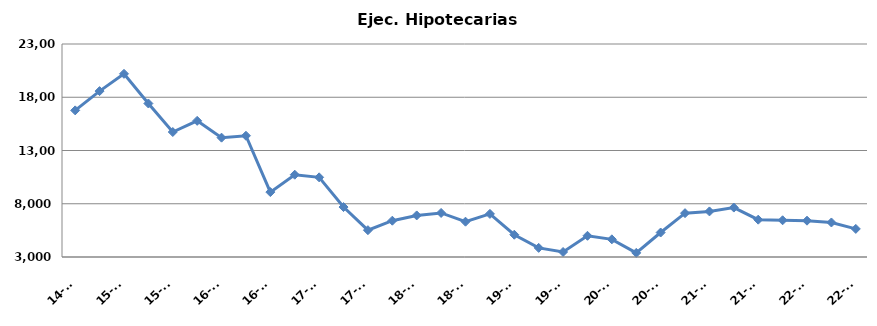
| Category | Ej. Hipotecarias |
|---|---|
| 14-T3 | 16767 |
| 14-T4 | 18578 |
| 15-T1 | 20201 |
| 15-T2 | 17414 |
| 15-T3 | 14735 |
| 15-T4 | 15785 |
| 16-T1 | 14205 |
| 16-T2 | 14385 |
| 16-T3 | 9094 |
| 16-T4 | 10726 |
| 17-T1 | 10478 |
| 17-T2 | 7689 |
| 17-T3 | 5518 |
| 17-T4 | 6409 |
| 18-T1 | 6903 |
| 18-T2 | 7137 |
| 18-T3 | 6315 |
| 18-T4 | 7049 |
| 19-T1 | 5092 |
| 19-T2 | 3857 |
| 19-T3 | 3470 |
| 19-T4 | 4992 |
| 20-T1 | 4658 |
| 20-T2 | 3387 |
| 20-T3 | 5299 |
| 20-T4 | 7116 |
| 21-T1 | 7280 |
| 21-T2 | 7641 |
| 21-T3 | 6504 |
| 21-T4 | 6449 |
| 22-T1 | 6410 |
| 22-T2 | 6242 |
| 22-T3 | 5637 |